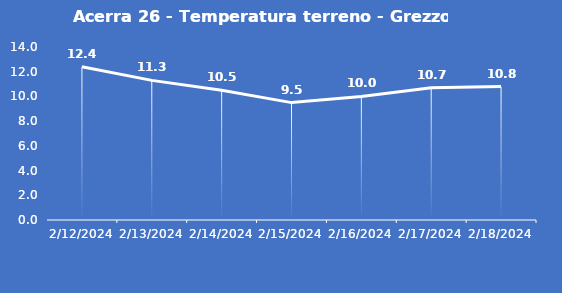
| Category | Acerra 26 - Temperatura terreno - Grezzo (°C) |
|---|---|
| 2/12/24 | 12.4 |
| 2/13/24 | 11.3 |
| 2/14/24 | 10.5 |
| 2/15/24 | 9.5 |
| 2/16/24 | 10 |
| 2/17/24 | 10.7 |
| 2/18/24 | 10.8 |